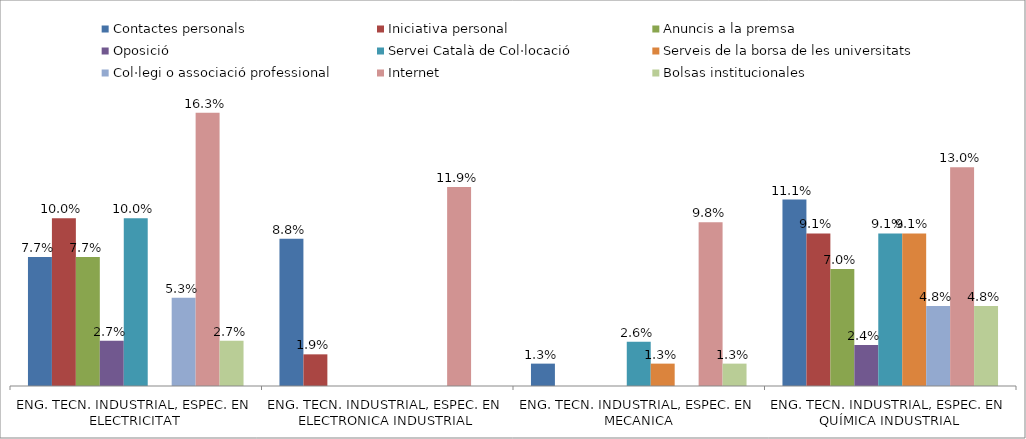
| Category | Contactes personals | Iniciativa personal | Anuncis a la premsa | Oposició | Servei Català de Col·locació | Serveis de la borsa de les universitats | Col·legi o associació professional | Internet | Bolsas institucionales |
|---|---|---|---|---|---|---|---|---|---|
| ENG. TECN. INDUSTRIAL, ESPEC. EN ELECTRICITAT | 0.077 | 0.1 | 0.077 | 0.027 | 0.1 | 0 | 0.053 | 0.163 | 0.027 |
| ENG. TECN. INDUSTRIAL, ESPEC. EN ELECTRONICA INDUSTRIAL | 0.088 | 0.019 | 0 | 0 | 0 | 0 | 0 | 0.119 | 0 |
| ENG. TECN. INDUSTRIAL, ESPEC. EN MECANICA | 0.013 | 0 | 0 | 0 | 0.026 | 0.013 | 0 | 0.098 | 0.013 |
| ENG. TECN. INDUSTRIAL, ESPEC. EN QUÍMICA INDUSTRIAL | 0.111 | 0.091 | 0.07 | 0.024 | 0.091 | 0.091 | 0.048 | 0.13 | 0.048 |